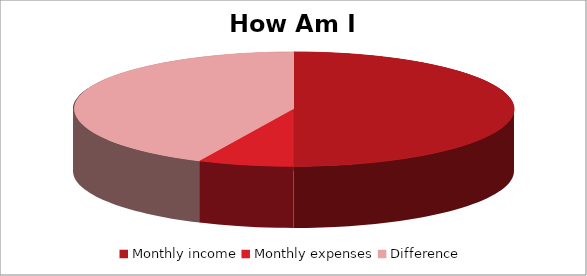
| Category | How am I doing? Amount |
|---|---|
| Monthly income | 500 |
| Monthly expenses | 70 |
| Difference | 430 |